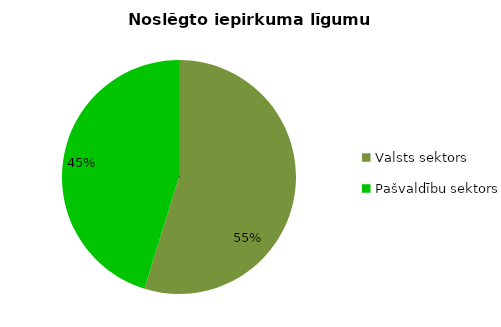
| Category | Noslēgto iepirkuma līgumu skaits |
|---|---|
| Valsts sektors | 10002 |
| Pašvaldību sektors | 8257 |